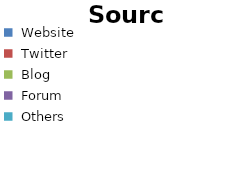
| Category | Posts | Visitors |
|---|---|---|
| Website | 0 | 0 |
| Twitter | 0 | 0 |
| Blog | 0 | 0 |
| Forum | 0 | 0 |
| Others | 0 | 0 |